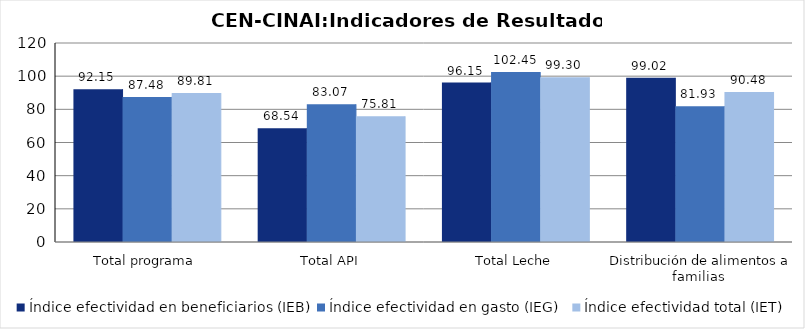
| Category | Índice efectividad en beneficiarios (IEB) | Índice efectividad en gasto (IEG)  | Índice efectividad total (IET) |
|---|---|---|---|
| Total programa | 92.146 | 87.48 | 89.813 |
| Total API | 68.543 | 83.073 | 75.808 |
| Total Leche | 96.154 | 102.45 | 99.302 |
| Distribución de alimentos a familias  | 99.02 | 81.934 | 90.477 |